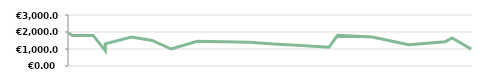
| Category | TUOTTO |
|---|---|
| 2013-04-23 | 1950 |
| 2013-04-25 | 1800 |
| 2013-05-07 | 1800 |
| 2013-05-14 | 900 |
| 2013-05-14 | 1300 |
| 2013-05-29 | 1700 |
| 2013-06-10 | 1500 |
| 2013-06-21 | 1000 |
| 2013-07-06 | 1450 |
| 2013-08-05 | 1400 |
| 2013-08-19 | 1300 |
| 2013-09-04 | 1200 |
| 2013-09-20 | 1100 |
| 2013-09-25 | 1800 |
| 2013-10-15 | 1700 |
| 2013-11-05 | 1250 |
| 2013-11-26 | 1425 |
| 2013-11-30 | 1650 |
| 2013-12-11 | 1000 |